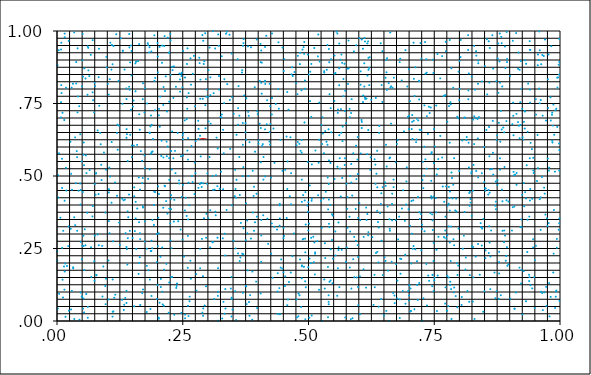
| Category | Series 0 |
|---|---|
| 0.650019433241347 | 0.019 |
| 0.913542592723124 | 0.714 |
| 0.797904704663123 | 0.699 |
| 0.63942652683806 | 0.049 |
| 0.111549496955486 | 0.275 |
| 0.98992359974181 | 0.515 |
| 0.315992959662965 | 0.502 |
| 0.451499784630852 | 0.294 |
| 0.560988519785409 | 0.813 |
| 0.569578690425192 | 0.776 |
| 0.130099128005586 | 0.749 |
| 0.347297645384479 | 0.922 |
| 0.921291770284048 | 0.676 |
| 0.933757099921347 | 0.537 |
| 0.237852281759125 | 0.121 |
| 0.0748587341847368 | 0.821 |
| 0.450344716827251 | 0.168 |
| 0.94974738769233 | 0.045 |
| 0.572588026317355 | 0.561 |
| 0.382621215065787 | 0.617 |
| 0.144555429906286 | 0.798 |
| 0.502400468850817 | 0.467 |
| 0.486402831806082 | 0.58 |
| 0.144873778371793 | 0.311 |
| 0.703877231389577 | 0.034 |
| 0.301079954218916 | 0.865 |
| 0.198864952521608 | 0.076 |
| 0.332374834870256 | 0.751 |
| 0.50634249399253 | 0.019 |
| 0.269702939405574 | 0.479 |
| 0.615368554757631 | 0.349 |
| 0.501592919238548 | 0.011 |
| 0.0826819807969012 | 0.438 |
| 0.281373972342455 | 0.662 |
| 0.702116884602505 | 0.033 |
| 0.0177920677915906 | 0.805 |
| 0.775410153946954 | 0.035 |
| 0.85998983905273 | 0.27 |
| 0.878420567562954 | 0.683 |
| 0.031789077001132 | 0.818 |
| 0.257822771674293 | 0.696 |
| 0.985117337145983 | 0.615 |
| 0.199939618646256 | 0.124 |
| 0.743976185086714 | 0.577 |
| 0.738020350828267 | 0.157 |
| 0.106136539610613 | 0.96 |
| 0.251252093617191 | 0.648 |
| 0.57844998840762 | 0.817 |
| 0.506653547682238 | 0.54 |
| 0.504749435963487 | 0.2 |
| 0.939466742251737 | 0.151 |
| 0.951914983616054 | 0.765 |
| 0.98667346409156 | 0.167 |
| 0.851555413261673 | 0.217 |
| 0.10337923052268 | 0.455 |
| 0.837539586669289 | 0.889 |
| 0.998464709563785 | 0.973 |
| 0.729810329262311 | 0.501 |
| 0.885481405270826 | 0.413 |
| 0.330166843618506 | 0.659 |
| 0.505476301252431 | 0.287 |
| 0.328421668051404 | 0.009 |
| 0.331609532729016 | 0.578 |
| 0.162597222977806 | 0.495 |
| 0.825008968455772 | 0.258 |
| 0.728716461472937 | 0.078 |
| 0.202477743817167 | 0.709 |
| 0.87887741172064 | 0.203 |
| 0.247689641334122 | 0.845 |
| 0.55959584128315 | 0.34 |
| 0.664274581809472 | 0.809 |
| 0.594596123569802 | 0.605 |
| 0.676714477244329 | 0.139 |
| 0.916712184842293 | 0.87 |
| 0.724460682739691 | 0.905 |
| 0.702797077665224 | 0.112 |
| 0.193746057533654 | 0.828 |
| 0.161142362609356 | 0.896 |
| 0.2856380355099 | 0.568 |
| 0.728294262673364 | 0.458 |
| 0.0144609247719709 | 0.693 |
| 0.539945575754017 | 0.066 |
| 0.0682296955020211 | 0.152 |
| 0.653398843069755 | 0.466 |
| 0.618600581812663 | 0.295 |
| 0.661080692482688 | 0.351 |
| 0.964912364211534 | 0.917 |
| 0.0624052649559319 | 0.864 |
| 0.849603717303589 | 0.479 |
| 0.695339743190939 | 0.53 |
| 0.8757009156601 | 0.485 |
| 0.997997651049539 | 0.612 |
| 0.755396027347833 | 0.034 |
| 0.859477871042445 | 0.327 |
| 0.819512076532325 | 0.442 |
| 0.159526645608055 | 0.388 |
| 0.676400586964848 | 0.078 |
| 0.370773335961853 | 0.958 |
| 0.8940920336608 | 0.997 |
| 0.43505499625744 | 0.748 |
| 0.961514891913874 | 0.314 |
| 0.818374066750562 | 0.615 |
| 0.705384576696664 | 0.301 |
| 0.344306480074546 | 0.594 |
| 0.229629740274298 | 0.865 |
| 0.347265514288562 | 0.081 |
| 0.489273841764584 | 0.434 |
| 0.880712452566315 | 0.561 |
| 0.489911198345699 | 0.283 |
| 0.378112325581699 | 0.346 |
| 0.893772981073077 | 0.416 |
| 0.143199838308547 | 0.436 |
| 0.817866183082069 | 0.795 |
| 0.468721284970693 | 0.845 |
| 0.0517758640451352 | 0.843 |
| 0.938502358391495 | 0.159 |
| 0.532623113930782 | 0.268 |
| 0.998338008732983 | 0.337 |
| 0.754463572388784 | 0.246 |
| 0.213132604161443 | 0.948 |
| 0.845397892319972 | 0.319 |
| 0.138102472963075 | 0.255 |
| 0.174527363971233 | 0.274 |
| 0.586945446238847 | 0.433 |
| 0.441101154633051 | 0.732 |
| 0.239929062050423 | 0.649 |
| 0.541766490213324 | 0.135 |
| 0.40595995382985 | 0.933 |
| 0.486745300910933 | 0.487 |
| 0.405175636590955 | 0.547 |
| 0.178653803478697 | 0.249 |
| 0.786353337823045 | 0.423 |
| 0.117794233022583 | 0.989 |
| 0.360944297748327 | 0.81 |
| 0.932363302340618 | 0.068 |
| 0.333188222929193 | 0.301 |
| 0.772749217011981 | 0.963 |
| 0.110420735504672 | 0.015 |
| 0.655775997117834 | 0.797 |
| 0.913600193890986 | 0.47 |
| 0.824595586068227 | 0.843 |
| 0.422215095114719 | 0.619 |
| 0.109007560532956 | 0.952 |
| 0.946661065525658 | 0.563 |
| 0.1043908958808 | 0.303 |
| 0.906095656391683 | 0.393 |
| 0.480153236599951 | 0.095 |
| 0.860399663374758 | 0.942 |
| 0.730526379707854 | 0.744 |
| 0.565065784573281 | 0.649 |
| 0.40293654385289 | 0.68 |
| 0.712640321671887 | 0.875 |
| 0.381147688274649 | 0.708 |
| 0.430308750032734 | 0.664 |
| 0.858909690392046 | 0.669 |
| 0.730528341952479 | 0.601 |
| 0.46284140437017 | 0.43 |
| 0.820284686426478 | 0.397 |
| 0.41337267812336 | 0.499 |
| 0.907701618988555 | 0.514 |
| 0.231331372858934 | 0.561 |
| 0.872534189787079 | 0.412 |
| 0.115428223981445 | 0.478 |
| 0.187915809816928 | 0.277 |
| 0.967756622830172 | 0.914 |
| 0.609548206085972 | 0.178 |
| 0.0527337200557445 | 0.078 |
| 0.62291498624542 | 0.521 |
| 0.258274812605185 | 0.771 |
| 0.412914511844483 | 0.827 |
| 0.18124626503784 | 0.49 |
| 0.130973599849021 | 0.932 |
| 0.425691601436877 | 0.232 |
| 0.140627974806496 | 0.552 |
| 0.616980702696693 | 0.369 |
| 0.169322449883479 | 0.475 |
| 0.488313434743307 | 0.281 |
| 0.186725544324701 | 0.577 |
| 0.923812363001745 | 0.323 |
| 0.540418978674543 | 0.472 |
| 0.320415093178555 | 0.101 |
| 0.0965769498909022 | 0.058 |
| 0.674148593616143 | 0.196 |
| 0.119334302460945 | 0.432 |
| 0.457870051487964 | 0.054 |
| 0.893453019275215 | 0.689 |
| 0.907559670056606 | 0.641 |
| 0.493050281479064 | 0.829 |
| 0.575578156910339 | 0.473 |
| 0.969051420855459 | 0.099 |
| 0.949986441955812 | 0.21 |
| 0.906283542221247 | 0.966 |
| 0.612838506870949 | 0.766 |
| 0.645414229581619 | 0.814 |
| 0.219563451263493 | 0.37 |
| 0.303374775741462 | 0.943 |
| 0.23552453366821 | 0.51 |
| 0.145600315239809 | 0.642 |
| 0.991922905825994 | 0.102 |
| 0.227065844689383 | 0.586 |
| 0.44561242764553 | 0.212 |
| 0.747165458877866 | 0.314 |
| 0.543765355083132 | 0.545 |
| 0.294871331241815 | 0.744 |
| 0.0766599890284499 | 0.435 |
| 0.0380832796245175 | 0.819 |
| 0.000969732157645952 | 0.882 |
| 0.391743729720097 | 0.311 |
| 0.603638981810214 | 0.815 |
| 0.226819409154927 | 0.386 |
| 0.608434313992281 | 0.755 |
| 0.636816930957454 | 0.238 |
| 0.296843438751619 | 0.773 |
| 0.290303332554167 | 0.154 |
| 0.1222495180289 | 0.828 |
| 0.605404588687509 | 0.693 |
| 0.259851772619127 | 0.183 |
| 0.015445767762079 | 0.978 |
| 0.725633805114893 | 0.317 |
| 0.380352968928714 | 0.5 |
| 0.952070233907624 | 0.259 |
| 0.817352581661365 | 0.935 |
| 0.0321066177204708 | 0.185 |
| 0.909564586119295 | 0.043 |
| 0.0382865836596439 | 0.893 |
| 0.817818091375442 | 0.765 |
| 0.044648232971714 | 0.004 |
| 0.404996833528221 | 0.893 |
| 0.210178790561285 | 0.057 |
| 0.304617155899945 | 0.254 |
| 0.312665960724126 | 0.076 |
| 0.798415736455056 | 0.86 |
| 0.3694817968952 | 0.097 |
| 0.908783630163221 | 0.503 |
| 0.997982642124078 | 0.85 |
| 0.157067233521285 | 0.894 |
| 0.190788632767396 | 0.628 |
| 0.992724487125009 | 0.732 |
| 0.343729692175012 | 0.762 |
| 0.213947059102899 | 0.982 |
| 0.925663479626782 | 0.634 |
| 0.567636879383149 | 0.62 |
| 0.282987636806011 | 0.908 |
| 0.569452969170236 | 0.834 |
| 0.00808825684332137 | 0.936 |
| 0.163239553407606 | 0.955 |
| 0.150484356356137 | 0.286 |
| 0.457845550690904 | 0.789 |
| 0.163175601139718 | 0.341 |
| 0.888795560607806 | 0.272 |
| 0.696488696607459 | 0.809 |
| 0.0139761805540775 | 0.188 |
| 0.689712403313547 | 0.654 |
| 0.779273535020672 | 0.741 |
| 0.531315797877848 | 0.857 |
| 0.423517719515217 | 0.608 |
| 0.818760131829447 | 0.854 |
| 0.376117052223967 | 0.12 |
| 0.6470579442826 | 0.931 |
| 0.742966321138021 | 0.736 |
| 0.110552035500213 | 0.885 |
| 0.192667993883522 | 0.4 |
| 0.506182620981093 | 0.415 |
| 0.885114359910683 | 0.809 |
| 0.234610663123545 | 0.587 |
| 0.0508361353399738 | 0.899 |
| 0.880750872022784 | 0.822 |
| 0.368326247478349 | 0.232 |
| 0.376375447880173 | 0.768 |
| 0.337700303239137 | 0.997 |
| 0.509632673587034 | 0.291 |
| 0.654973654768622 | 0.858 |
| 0.941124786114673 | 0.935 |
| 0.662519568237194 | 0.995 |
| 0.255735860053516 | 0.425 |
| 0.739735742376393 | 0.138 |
| 0.547584150479141 | 0.13 |
| 0.70461686991173 | 0.414 |
| 0.666900893086879 | 0.805 |
| 0.540589811445831 | 0.419 |
| 0.710510605454008 | 0.041 |
| 0.645113900583482 | 0.277 |
| 0.486726630734273 | 0.188 |
| 0.0757632133576928 | 0.809 |
| 0.49252438367081 | 0.416 |
| 0.348847014838554 | 0.04 |
| 0.927846534943452 | 0.172 |
| 0.851515262816362 | 0.449 |
| 0.200299961314574 | 0.912 |
| 0.323386413683172 | 0.456 |
| 0.921093768842726 | 0.755 |
| 0.699809204097905 | 0.071 |
| 0.136388189253776 | 0.303 |
| 0.212187393906055 | 0.052 |
| 0.231391191845081 | 0.769 |
| 0.789621169826782 | 0.116 |
| 0.331006409422679 | 0.066 |
| 0.941562268640044 | 0.614 |
| 0.365528199259807 | 0.338 |
| 0.470962119957467 | 0.302 |
| 0.403132675401951 | 0.827 |
| 0.369714491145545 | 0.499 |
| 0.148744370836342 | 0.605 |
| 0.588958444660724 | 0.578 |
| 0.260588733162385 | 0.35 |
| 0.132393144990497 | 0.416 |
| 0.0151555577319516 | 0.415 |
| 0.997422777566159 | 0.315 |
| 0.585219539284335 | 0.112 |
| 0.360014274470714 | 0.233 |
| 0.413523196956644 | 0.661 |
| 0.370542818588446 | 0.531 |
| 0.651358900615318 | 0.22 |
| 0.38563558460127 | 0.284 |
| 0.250438490193473 | 0.469 |
| 0.692316652175999 | 0.228 |
| 0.265411836502986 | 0.906 |
| 0.0177302814391588 | 0.528 |
| 0.354944676606949 | 0.25 |
| 0.0708485767337154 | 0.788 |
| 0.668184768108649 | 0.097 |
| 0.614416378966678 | 0.115 |
| 0.0572875543732563 | 0.571 |
| 0.540501282061132 | 0.938 |
| 0.773512960220327 | 0.464 |
| 0.699850097085079 | 0.662 |
| 0.793561136543082 | 0.422 |
| 0.291846256087618 | 0.886 |
| 0.074175363082951 | 0.206 |
| 0.897564944657603 | 0.412 |
| 0.833368412389253 | 0.517 |
| 0.583046280964628 | 0.5 |
| 0.836622138160511 | 0.63 |
| 0.281183233675094 | 0.628 |
| 0.138178633422156 | 0.632 |
| 0.748550152520715 | 0.103 |
| 0.938913777750866 | 0.36 |
| 0.506662828260622 | 0.422 |
| 0.708924876240856 | 0.96 |
| 0.626952800496421 | 0.289 |
| 0.108685428978344 | 0.617 |
| 0.498718682246387 | 0.919 |
| 0.0109068811921086 | 0.718 |
| 0.0880187975741183 | 0.539 |
| 0.673211768467339 | 0.548 |
| 0.356913897159791 | 0.487 |
| 0.464821945659999 | 0.167 |
| 0.00839326456534384 | 0.813 |
| 0.865488777273879 | 0.986 |
| 0.0550437967825524 | 0.316 |
| 0.771697173249163 | 0.778 |
| 0.012480906190376 | 0.311 |
| 0.205680159467213 | 0.221 |
| 0.884143795901099 | 0.66 |
| 0.66411329646042 | 0.681 |
| 0.33594058450324 | 0.991 |
| 0.745094897016659 | 0.582 |
| 0.49030295783431 | 0.944 |
| 0.448401667432809 | 0.518 |
| 0.442555199373011 | 0.329 |
| 0.385630716403117 | 0.944 |
| 0.410689194767185 | 0.565 |
| 0.561287145697986 | 0.641 |
| 0.378361655737519 | 0.302 |
| 0.0827918442423218 | 0.841 |
| 0.250587542025297 | 0.627 |
| 0.594424846734392 | 0.276 |
| 0.955851382929086 | 0.882 |
| 0.347802495033519 | 0.399 |
| 0.947867163148134 | 0.51 |
| 0.699985025024425 | 0.088 |
| 0.406078639736919 | 0.295 |
| 0.952412321636046 | 0.712 |
| 0.23227900364054 | 0.343 |
| 0.836248254276904 | 0.697 |
| 0.829333419599529 | 0.948 |
| 0.0565611771897969 | 0.261 |
| 0.521011891637175 | 0.625 |
| 0.223034854163622 | 0.756 |
| 0.0932734514124489 | 0.581 |
| 0.659437035797441 | 0.82 |
| 0.327536531221523 | 0.712 |
| 0.876097332593814 | 0.905 |
| 0.880869976790398 | 0.522 |
| 0.598003006469349 | 0.634 |
| 0.994546713275192 | 0.669 |
| 0.984534243307278 | 0.719 |
| 0.638247979134657 | 0.341 |
| 0.0614409045864405 | 0.049 |
| 0.646905578678258 | 0.755 |
| 0.225978958359622 | 0.968 |
| 0.701665184762426 | 0.329 |
| 0.776602819712466 | 0.398 |
| 0.31883614637054 | 0.465 |
| 0.00670798032668851 | 0.356 |
| 0.894491628180437 | 0.255 |
| 0.653059355291333 | 0.839 |
| 0.211872690692472 | 0.807 |
| 0.923587191092655 | 0.176 |
| 0.0428003030151031 | 0.449 |
| 0.789021385111155 | 0.099 |
| 0.567092682579486 | 0.493 |
| 0.481826554287649 | 0.611 |
| 0.0148245096061731 | 0.108 |
| 0.83017370571861 | 0.007 |
| 0.872808419161835 | 0.385 |
| 0.370749699153706 | 0.32 |
| 0.581358258450538 | 0.36 |
| 0.356943794459891 | 0.642 |
| 0.581740259098415 | 0.732 |
| 0.422811706973811 | 0.818 |
| 0.494566818734207 | 0.333 |
| 0.0961861895840562 | 0.374 |
| 0.0677215868405495 | 0.254 |
| 0.526413452486456 | 0.322 |
| 0.334512441219369 | 0.226 |
| 0.800233524680564 | 0.897 |
| 0.744053159520189 | 0.43 |
| 0.493819881410784 | 0.444 |
| 0.393548140395217 | 0.34 |
| 0.174793030576957 | 0.344 |
| 0.425310912350369 | 0.494 |
| 0.409858824498678 | 0.365 |
| 0.297749526071746 | 0.798 |
| 0.717532575161506 | 0.428 |
| 0.08316765911827 | 0.261 |
| 0.984093816562847 | 0.711 |
| 0.427422513915623 | 0.769 |
| 0.769758514238307 | 0.411 |
| 0.894748134325838 | 0.893 |
| 0.588851693157795 | 0.213 |
| 0.571617786685387 | 0.887 |
| 0.0751738056879494 | 0.472 |
| 0.75680074053516 | 0.157 |
| 0.785246921479967 | 0.493 |
| 0.110881435135526 | 0.032 |
| 0.576978388000185 | 0.87 |
| 0.258556921798759 | 0.886 |
| 0.138128064278324 | 0.765 |
| 0.885730490886935 | 0.311 |
| 0.996289437027121 | 0.84 |
| 0.48807877908389 | 0.936 |
| 0.519511887312088 | 0.988 |
| 0.334666592565462 | 0.11 |
| 0.772489507764785 | 0.116 |
| 0.975974270346598 | 0.833 |
| 0.539120003386462 | 0.385 |
| 0.72060890354436 | 0.375 |
| 0.827775389898807 | 0.151 |
| 0.363221345927673 | 0.207 |
| 0.389051278476255 | 0.518 |
| 0.619160423096189 | 0.907 |
| 0.620486074196791 | 0.873 |
| 0.927139614608698 | 0.625 |
| 0.615425655172693 | 0.767 |
| 0.990762357202134 | 0.726 |
| 0.666309522727804 | 0.439 |
| 0.374601063906179 | 0.65 |
| 0.561136946240827 | 0.871 |
| 0.409126354933664 | 0.61 |
| 0.783435647196964 | 0.326 |
| 0.512658610453177 | 0.16 |
| 0.860091875518446 | 0.442 |
| 0.857316016183058 | 0.436 |
| 0.310433407181059 | 0.452 |
| 0.562885684513758 | 0.526 |
| 0.789450866495667 | 0.561 |
| 0.348317106568428 | 0.772 |
| 0.249322826568031 | 0.806 |
| 0.356062937201904 | 0.003 |
| 0.795580023604694 | 0.704 |
| 0.360043298193107 | 0.734 |
| 0.621550662074427 | 0.91 |
| 0.787702328442949 | 0.47 |
| 0.88327346431266 | 0.98 |
| 0.930529374704616 | 0.723 |
| 0.93083011713974 | 0.899 |
| 0.295918273389461 | 0.834 |
| 0.0704048081079488 | 0.361 |
| 0.478976993888518 | 0.914 |
| 0.494683139753132 | 0.116 |
| 0.842835923569453 | 0.324 |
| 0.0989516644562558 | 0.875 |
| 0.644791338279398 | 0.44 |
| 0.982617948961942 | 0.948 |
| 0.974095958532252 | 0.354 |
| 0.718226470007246 | 0.692 |
| 0.497712402203415 | 0.398 |
| 0.475500643017723 | 0.82 |
| 0.838894465120305 | 0.703 |
| 0.90929872153425 | 0.395 |
| 0.152638027935463 | 0.605 |
| 0.444128393671819 | 0.624 |
| 0.375868590825 | 0.406 |
| 0.987855756623724 | 0.383 |
| 0.709277693908142 | 0.691 |
| 0.814704272924271 | 0.634 |
| 0.00797295427831235 | 0.755 |
| 0.440338507774913 | 0.961 |
| 0.964566393984246 | 0.096 |
| 0.266106505446092 | 0.146 |
| 0.685767069879463 | 0.388 |
| 0.372196366547674 | 0.778 |
| 0.889106558413256 | 0.312 |
| 0.928236833632597 | 0.687 |
| 0.95774969216194 | 0.9 |
| 0.396059362977545 | 0.136 |
| 0.58489980134649 | 0.541 |
| 0.735354958115932 | 0.706 |
| 0.92780194261084 | 0.476 |
| 0.61456807484397 | 0.391 |
| 0.156439967369744 | 0.411 |
| 0.112291642004535 | 0.948 |
| 0.623775525613526 | 0.564 |
| 0.0672672496845972 | 0.918 |
| 0.153497294504276 | 0.051 |
| 0.0519446495468424 | 0.043 |
| 0.619262003465038 | 0.866 |
| 0.866402611338251 | 0.69 |
| 0.682192942186778 | 0.215 |
| 0.450431606861512 | 0.322 |
| 0.972567218227284 | 0.118 |
| 0.633893383537419 | 0.769 |
| 0.86983872269124 | 0.167 |
| 0.103163665937027 | 0.443 |
| 0.918390455475775 | 0.673 |
| 0.64740471042435 | 0.462 |
| 0.491308625866491 | 0.921 |
| 0.58468598159332 | 0.717 |
| 0.86719497065476 | 0.505 |
| 0.437411576021542 | 0.315 |
| 0.407804932991903 | 0.604 |
| 0.553576633412813 | 0.855 |
| 0.849296375959005 | 0.6 |
| 0.226822422197537 | 0.434 |
| 0.178914603825042 | 0.75 |
| 0.538771815444515 | 0.013 |
| 0.823330118688047 | 0.51 |
| 0.940058782066133 | 0.798 |
| 0.527967056079926 | 0.702 |
| 0.217378216266864 | 0.197 |
| 0.56686016719422 | 0.89 |
| 0.0266954073651916 | 0.618 |
| 0.538669330654533 | 0.187 |
| 0.442709012855601 | 0.399 |
| 0.511489602197429 | 0.941 |
| 0.701629879617842 | 0.758 |
| 0.59526184808889 | 0.489 |
| 0.301503927675617 | 0.688 |
| 0.145462704707785 | 0.892 |
| 0.147058354716352 | 0.729 |
| 0.522145097752216 | 0.894 |
| 0.647604504589617 | 0.158 |
| 0.0168030013817523 | 0.014 |
| 0.87755413287115 | 0.787 |
| 0.962590595908618 | 0.885 |
| 0.199916808273097 | 0.959 |
| 0.905303049377971 | 0.679 |
| 0.612257218692378 | 0.964 |
| 0.909753434676885 | 0.042 |
| 0.505536043184982 | 0.704 |
| 0.889834832917884 | 0.531 |
| 0.103207212611056 | 0.344 |
| 0.602705983080799 | 0.347 |
| 0.975731307377641 | 0.56 |
| 0.536439659034966 | 0.866 |
| 0.393803347859429 | 0.584 |
| 0.685325381626552 | 0.829 |
| 0.0537784315827195 | 0.03 |
| 0.705258310595993 | 0.662 |
| 0.444700303919857 | 0.184 |
| 0.781243178667325 | 0.446 |
| 0.289069632762546 | 0.986 |
| 0.389397826913183 | 0.374 |
| 0.661891459682609 | 0.311 |
| 0.205090277606648 | 0.774 |
| 0.844599634817966 | 0.26 |
| 0.0342550024224207 | 0.357 |
| 0.13553407897583 | 0.079 |
| 0.782836044636484 | 0.747 |
| 0.108173101011566 | 0.867 |
| 0.587664307424569 | 0.01 |
| 0.220267551864777 | 0.602 |
| 0.770396060964544 | 0.287 |
| 0.0538596202358398 | 0.537 |
| 0.608188748703503 | 0.939 |
| 0.0162902899506134 | 0.198 |
| 0.639705065911926 | 0.323 |
| 0.593789407328026 | 0.386 |
| 0.5191003673991 | 0.434 |
| 0.548070080941897 | 0.364 |
| 0.68294389700113 | 0.163 |
| 0.138136024282182 | 0.104 |
| 0.171087259901073 | 0.391 |
| 0.806599079574231 | 0.249 |
| 0.290891222856549 | 0.475 |
| 0.822089852458619 | 0.408 |
| 0.770390395675037 | 0.777 |
| 0.777918632302446 | 0.051 |
| 0.170621165155339 | 0.493 |
| 0.527118762696037 | 0.61 |
| 0.432181750890264 | 0.325 |
| 0.775952109616128 | 0.156 |
| 0.153474499364663 | 0.461 |
| 0.771847332818232 | 0.312 |
| 0.397392120195175 | 0.36 |
| 0.734754358469453 | 0.525 |
| 0.745844433155872 | 0.368 |
| 0.483270469655837 | 0.925 |
| 0.248179238148113 | 0.856 |
| 0.561456554814907 | 0.117 |
| 0.376925389026571 | 0.058 |
| 0.678088121210545 | 0.281 |
| 0.00144306637275449 | 0.043 |
| 0.98184040591841 | 0.691 |
| 0.232490477071639 | 0.878 |
| 0.634209562541096 | 0.235 |
| 0.784055077101609 | 0.871 |
| 0.789488358615235 | 0.261 |
| 0.0400808163075038 | 0.311 |
| 0.493098573469885 | 0.801 |
| 0.657353841331287 | 0.395 |
| 0.398240047452418 | 0.723 |
| 0.761893924554557 | 0.837 |
| 0.999049167876344 | 0.353 |
| 0.319402155983952 | 0.595 |
| 0.721169687356631 | 0.66 |
| 0.636402420512136 | 0.38 |
| 0.263077519538957 | 0.399 |
| 0.13893489399532 | 0.248 |
| 0.476219233783443 | 0.606 |
| 0.968353023487789 | 0.46 |
| 0.887193842615262 | 0.667 |
| 0.289831389428361 | 0.766 |
| 0.274525686372453 | 0.74 |
| 0.273476652577845 | 0.438 |
| 0.419742036542408 | 0.266 |
| 0.249773489377816 | 0.64 |
| 0.681213258677641 | 0.893 |
| 0.49330597561721 | 0.137 |
| 0.143694025815469 | 0.99 |
| 0.900439049679136 | 0.845 |
| 0.44804265747386 | 0.181 |
| 0.707141537083294 | 0.249 |
| 0.88021696350717 | 0.991 |
| 0.878949424814684 | 0.164 |
| 0.714606496263641 | 0.626 |
| 0.723614296436081 | 0.369 |
| 0.315446315754911 | 0.365 |
| 0.579561758054355 | 0.871 |
| 0.163564692003906 | 0.713 |
| 0.225318400863191 | 0.99 |
| 0.978435429784518 | 0.529 |
| 0.153653843908615 | 0.43 |
| 0.499524480885048 | 0.185 |
| 0.356072900341644 | 0.425 |
| 0.45036795632459 | 0.286 |
| 0.078362404089466 | 0.157 |
| 0.0298072452563846 | 0.452 |
| 0.388143974452133 | 0.004 |
| 0.561132681656715 | 0.957 |
| 0.485328701491842 | 0.048 |
| 0.851098275324512 | 0.458 |
| 0.0152820788999105 | 0.991 |
| 0.18577987429868 | 0.041 |
| 0.0493242176999937 | 0.213 |
| 0.185845179709259 | 0.671 |
| 0.681580590112334 | 0.01 |
| 0.502058242602544 | 0.215 |
| 0.889064597886441 | 0.651 |
| 0.792777650526417 | 0.086 |
| 0.218351026653657 | 0.568 |
| 0.579674513579109 | 0.967 |
| 0.486456983259965 | 0.147 |
| 0.300410697538666 | 0.772 |
| 0.956090347508856 | 0.527 |
| 0.206534237957083 | 0.145 |
| 0.201456287932779 | 0.356 |
| 0.397307158665799 | 0.971 |
| 0.773127842401335 | 0.93 |
| 0.490930419201321 | 0.187 |
| 0.188103069136819 | 0.582 |
| 0.598069314155925 | 0.262 |
| 0.223141016381743 | 0.487 |
| 0.0807699149925061 | 0.657 |
| 0.503357038282847 | 0.86 |
| 0.183126896063541 | 0.926 |
| 0.837266956464954 | 0.898 |
| 0.427019217533608 | 0.336 |
| 0.359046766419833 | 0.903 |
| 0.769069187114069 | 0.776 |
| 0.694693829339685 | 0.481 |
| 0.33316465255931 | 0.025 |
| 0.15603850381056 | 0.792 |
| 0.682434025329907 | 0.905 |
| 0.833650225806598 | 0.915 |
| 0.428853639920259 | 0.149 |
| 0.214961025220653 | 0.465 |
| 0.369892242141804 | 0.949 |
| 0.0903602891722892 | 0.084 |
| 0.115757257494459 | 0.091 |
| 0.55828046491562 | 0.718 |
| 0.0323391843675641 | 0.182 |
| 0.847679126283453 | 0.352 |
| 0.861200735363892 | 0.523 |
| 0.442920388113409 | 0.403 |
| 0.29073811747987 | 0.043 |
| 0.878257649947676 | 0.077 |
| 0.370954380598679 | 0.972 |
| 0.518674161721849 | 0.912 |
| 0.465344443938806 | 0.402 |
| 0.719964230575818 | 0.764 |
| 0.510560190719834 | 0.203 |
| 0.426973277776418 | 0.712 |
| 0.0612381377393477 | 0.011 |
| 0.665306284551313 | 0.204 |
| 0.802598651666543 | 0.969 |
| 0.61083241593035 | 0.889 |
| 0.195099280838822 | 0.444 |
| 0.958808081436104 | 0.998 |
| 0.576995933346853 | 0.387 |
| 0.133638160437626 | 0.056 |
| 0.783505054017665 | 0.11 |
| 0.304878642864806 | 0.84 |
| 0.362496150878593 | 0.708 |
| 0.500905134409757 | 0.85 |
| 0.223027833050411 | 0.924 |
| 0.958599587276321 | 0.802 |
| 0.577437425026566 | 0.427 |
| 0.353638359291936 | 0.431 |
| 0.631216086993703 | 0.159 |
| 0.795874359370542 | 0.047 |
| 0.0709970132960375 | 0.969 |
| 0.881308287679872 | 0.618 |
| 0.540740202329513 | 0.554 |
| 0.619118121158108 | 0.306 |
| 0.582231597463134 | 0.702 |
| 0.213790064784278 | 0.466 |
| 0.812822324247943 | 0.219 |
| 0.379125706027482 | 0.175 |
| 0.585119190461373 | 0.477 |
| 0.662736964483515 | 0.805 |
| 0.413610289849818 | 0.945 |
| 0.708089234179302 | 0.416 |
| 0.456589752998772 | 0.355 |
| 0.228927011738026 | 0.654 |
| 0.000334294722831641 | 0.24 |
| 0.976369338388398 | 0.735 |
| 0.640712538567269 | 0.672 |
| 0.998814217499354 | 0.069 |
| 0.564585452060992 | 0.731 |
| 0.350838898531486 | 0.277 |
| 0.673629468310531 | 0.348 |
| 0.406188675895723 | 0.348 |
| 0.48652505856436 | 0.624 |
| 0.743982921462582 | 0.483 |
| 0.170688149022862 | 0.396 |
| 0.817325772322166 | 0.986 |
| 0.246940353966482 | 0.853 |
| 0.779049369190856 | 0.462 |
| 0.700105458309943 | 0.123 |
| 0.753852956747086 | 0.374 |
| 0.244629145357118 | 0.833 |
| 0.138070167080521 | 0.802 |
| 0.827041252500066 | 0.449 |
| 0.548598459726847 | 0.215 |
| 0.895287733345486 | 0.19 |
| 0.134362948153868 | 0.867 |
| 0.236408201147342 | 0.808 |
| 0.226626108267797 | 0.422 |
| 0.890539428609658 | 0.947 |
| 0.313215552489448 | 0.453 |
| 0.820756165837217 | 0.158 |
| 0.238490703717231 | 0.129 |
| 0.746787196670915 | 0.158 |
| 0.684270828233954 | 0.214 |
| 0.208917628946518 | 0.95 |
| 0.0921512191964628 | 0.188 |
| 0.912790336048098 | 0.993 |
| 0.432557559873133 | 0.545 |
| 0.979034082945932 | 0.016 |
| 0.26073713790496 | 0.63 |
| 0.284732465694965 | 0.766 |
| 0.91953646631802 | 0.184 |
| 0.810183046583659 | 0.701 |
| 0.242574235051236 | 0.485 |
| 0.585900242377719 | 0.765 |
| 0.750093374105698 | 0.14 |
| 0.993786082814606 | 0.253 |
| 0.0362302612315486 | 0.331 |
| 0.987299523056865 | 0.232 |
| 0.774056038637478 | 0.284 |
| 0.954258485507246 | 0.483 |
| 0.590773822740817 | 0.29 |
| 0.984650206551278 | 0.621 |
| 0.610983008591757 | 0.809 |
| 0.184672133701784 | 0.143 |
| 0.393134729262876 | 0.806 |
| 0.162336059172615 | 0.162 |
| 0.452021424224321 | 0.903 |
| 0.990296198685688 | 0.045 |
| 0.669068164355292 | 0.462 |
| 0.940205697435587 | 0.416 |
| 0.808896504090785 | 0.294 |
| 0.528480077351655 | 0.646 |
| 0.573028812822919 | 0.012 |
| 0.275232688759643 | 0.51 |
| 0.141644608250325 | 0.358 |
| 0.203862444041114 | 0.945 |
| 0.998498547792504 | 0.519 |
| 0.840476400980242 | 0.16 |
| 0.769286779454767 | 0.289 |
| 0.541875614648305 | 0.782 |
| 0.591207332295836 | 0.151 |
| 0.252452562058043 | 0.223 |
| 0.0185542472550476 | 0.45 |
| 0.699600544189215 | 0.868 |
| 0.745962368904438 | 0.12 |
| 0.998595271181906 | 0.589 |
| 0.546782321613701 | 0.368 |
| 0.844675999824918 | 0.509 |
| 0.143919858582704 | 0.943 |
| 0.181629531180616 | 0.175 |
| 0.195183890733085 | 0.838 |
| 0.804845900041193 | 0.083 |
| 0.398948579737424 | 0.713 |
| 0.544791401464373 | 0.903 |
| 0.96209902945688 | 0.101 |
| 0.873418108838305 | 0.827 |
| 0.723923430320764 | 0.658 |
| 0.397770499461015 | 0.044 |
| 0.0512185011750124 | 0.445 |
| 0.750974834254111 | 0.602 |
| 0.970981089651552 | 0.367 |
| 0.00337345808147793 | 0.934 |
| 0.882477628309166 | 0.089 |
| 0.780862766376162 | 0.27 |
| 0.270073594046755 | 0.852 |
| 0.438756666530579 | 0.024 |
| 0.566207061208199 | 0.246 |
| 0.782282103811918 | 0.755 |
| 0.850553233521791 | 0.879 |
| 0.165536248939108 | 0.055 |
| 0.781884335784323 | 0.124 |
| 0.81350455352964 | 0.624 |
| 0.10289987115918 | 0.781 |
| 0.697819008628192 | 0.704 |
| 0.223038947420433 | 0.926 |
| 0.91976974974245 | 0.866 |
| 0.727373220391252 | 0.549 |
| 0.260224356603603 | 0.052 |
| 0.676977227864104 | 0.623 |
| 0.658065486969759 | 0.174 |
| 0.283545564800919 | 0.889 |
| 0.716019169275744 | 0.124 |
| 0.0461305777570207 | 0.644 |
| 0.498591246449339 | 0.549 |
| 0.551518521917296 | 0.853 |
| 0.295296209068467 | 0.665 |
| 0.36002279858831 | 0.677 |
| 0.666294901644899 | 0.347 |
| 0.68133889467938 | 0.075 |
| 0.708892446496146 | 0.259 |
| 0.72136800910355 | 0.352 |
| 0.49200706110525 | 0.684 |
| 0.309237041629679 | 0.5 |
| 0.981511281391433 | 0.083 |
| 0.734108803603677 | 0.902 |
| 0.787609905033883 | 0.804 |
| 0.479872128520327 | 0.016 |
| 0.130750524012263 | 0.932 |
| 0.576087739477858 | 0.253 |
| 0.347213184425238 | 0.152 |
| 0.0717761082259893 | 0.761 |
| 0.829255144001583 | 0.61 |
| 0.924982191810538 | 0.731 |
| 0.0737789529040699 | 0.719 |
| 0.852140319423349 | 0.244 |
| 0.826986064659983 | 0.255 |
| 0.929895936400422 | 0.664 |
| 0.207989243455239 | 0.622 |
| 0.292177404444215 | 0.354 |
| 0.483285428399344 | 0.212 |
| 0.261397794768473 | 0.477 |
| 0.155755851211491 | 0.888 |
| 0.540820585317823 | 0.335 |
| 0.0281322191799801 | 0.508 |
| 0.476180166323832 | 0.074 |
| 0.217060060639395 | 0.413 |
| 0.00419368788292029 | 0.094 |
| 0.456447961579066 | 0.636 |
| 0.929928903152526 | 0.723 |
| 0.317193901740391 | 0.632 |
| 0.104106821693237 | 0.529 |
| 0.988482880168765 | 0.642 |
| 0.183918093703247 | 0.65 |
| 0.297160130578597 | 0.369 |
| 0.0974776041136708 | 0.522 |
| 0.207253736425631 | 0.569 |
| 0.486962202669083 | 0.192 |
| 0.472061098827888 | 0.858 |
| 0.717266950227825 | 0.073 |
| 0.461066425110138 | 0.134 |
| 0.669690085933353 | 0.839 |
| 0.376004544208236 | 0.625 |
| 0.810462630120535 | 0.376 |
| 0.304888427095795 | 0.779 |
| 0.901200142570393 | 0.077 |
| 0.233194876210838 | 0.418 |
| 0.687611136877299 | 0.103 |
| 0.872363319328741 | 0.481 |
| 0.382773941622665 | 0.018 |
| 0.266473747698682 | 0.815 |
| 0.706286524144845 | 0.71 |
| 0.540359450441423 | 0.058 |
| 0.827025018751291 | 0.694 |
| 0.605903200321928 | 0.665 |
| 0.204376249338373 | 0.67 |
| 0.661440201436038 | 0.318 |
| 0.345654596769987 | 0.112 |
| 0.605875648935438 | 0.971 |
| 0.923135936192608 | 0.801 |
| 0.959697131004502 | 0.933 |
| 0.0236471177593754 | 0.036 |
| 0.233221929679686 | 0.022 |
| 0.247331115122924 | 0.028 |
| 0.0471343257609694 | 0.273 |
| 0.148274947538586 | 0.931 |
| 0.275669808180437 | 0.62 |
| 0.861826645588866 | 0.222 |
| 0.184193892633903 | 0.648 |
| 0.31441204912572 | 0.94 |
| 0.955461420668973 | 0.641 |
| 0.772108678368065 | 0.36 |
| 0.894782527439852 | 0.904 |
| 0.800355800435199 | 0.8 |
| 0.692726803565975 | 0.934 |
| 0.816001190553321 | 0.103 |
| 0.217894590454389 | 0.618 |
| 0.453618384489927 | 0.154 |
| 0.656253199988544 | 0.906 |
| 0.364601634245637 | 0.219 |
| 0.119118630792488 | 0.648 |
| 0.544109729409636 | 0.734 |
| 0.254617921239004 | 0.009 |
| 0.748348127956292 | 0.855 |
| 0.0441399375440231 | 0.741 |
| 0.375254063909556 | 0.278 |
| 0.10845943111405 | 0.408 |
| 0.140764749249701 | 0.286 |
| 0.584205980192799 | 0.006 |
| 0.388420812905653 | 0.171 |
| 0.258888236956576 | 0.732 |
| 0.157467897694463 | 0.248 |
| 0.310129520713381 | 0.272 |
| 0.746633884609613 | 0.159 |
| 0.0772783211085589 | 0.508 |
| 0.254196254558507 | 0.692 |
| 0.75733985957415 | 0.524 |
| 0.877456246937722 | 0.957 |
| 0.799644131558797 | 0.761 |
| 0.771627519902342 | 0.06 |
| 0.259355875845782 | 0.94 |
| 0.534257751453778 | 0.446 |
| 0.893125643589559 | 0.224 |
| 0.0581396915398941 | 0.093 |
| 0.396721138104435 | 0.439 |
| 0.03997034180465 | 0.565 |
| 0.981050020465164 | 0.771 |
| 0.50308001025947 | 0.758 |
| 0.780297427771669 | 0.424 |
| 0.662023778130194 | 0.564 |
| 0.69828220764127 | 0.103 |
| 0.112110345920857 | 0.033 |
| 0.0374346073881735 | 0.475 |
| 0.218671464038972 | 0.722 |
| 0.56384778289775 | 0.901 |
| 0.300718874193199 | 0.355 |
| 0.319836164727925 | 0.087 |
| 0.416107325540231 | 0.984 |
| 0.831191148707153 | 0.798 |
| 0.237033636656568 | 0.114 |
| 0.715771597076264 | 0.206 |
| 0.712238572639985 | 0.247 |
| 0.749468091703648 | 0.662 |
| 0.24103321916797 | 0.344 |
| 0.940016787032612 | 0.561 |
| 0.778596519447015 | 0.326 |
| 0.0344798639420685 | 0.007 |
| 0.796142255880537 | 0.159 |
| 0.520187606253759 | 0.546 |
| 0.274040011438266 | 0.546 |
| 0.265135260872027 | 0.208 |
| 0.261478741826738 | 0.017 |
| 0.546621432289133 | 0.279 |
| 0.170890535274617 | 0.82 |
| 0.724274758569711 | 0.244 |
| 0.148833795957463 | 0.565 |
| 0.194597085307245 | 0.727 |
| 0.498975413848794 | 0.377 |
| 0.00779810233031652 | 0.702 |
| 0.53998604526878 | 0.089 |
| 0.166709003312743 | 0.586 |
| 0.602257581858902 | 0.024 |
| 0.40459002017515 | 0.956 |
| 0.351405065643975 | 0.714 |
| 0.0505408981620406 | 0.26 |
| 0.640451670884988 | 0.649 |
| 0.060950549461152 | 0.947 |
| 0.828044349224368 | 0.538 |
| 0.187501358644409 | 0.242 |
| 0.744742423008019 | 0.423 |
| 0.748481189565116 | 0.428 |
| 0.713878601276861 | 0.617 |
| 0.631456593483096 | 0.558 |
| 0.875064219992101 | 0.64 |
| 0.284035788105974 | 0.472 |
| 0.18696874118741 | 0.709 |
| 0.558556572401337 | 0.729 |
| 0.418259724023508 | 0.353 |
| 0.748539313074015 | 0.207 |
| 0.216226787094346 | 0.844 |
| 0.782631562752613 | 0.207 |
| 0.710857442741178 | 0.776 |
| 0.31444409653271 | 0.377 |
| 0.946530394850306 | 0.282 |
| 0.0407017450496926 | 0.719 |
| 0.797780256109612 | 0.191 |
| 0.824494018510895 | 0.363 |
| 0.837299581051702 | 0.495 |
| 0.143347030663937 | 0.808 |
| 0.559910633702323 | 0.254 |
| 0.997513359753491 | 0.884 |
| 0.956329973017499 | 0.919 |
| 0.730580065926806 | 0.31 |
| 0.248156108169804 | 0.428 |
| 0.326097289591918 | 0.515 |
| 0.1521571482803 | 0.76 |
| 0.290449396515762 | 0.018 |
| 0.188157879832878 | 0.676 |
| 0.501096340921415 | 0.336 |
| 0.606066969202127 | 0.686 |
| 0.511743415506355 | 0.271 |
| 0.0542711036009707 | 0.871 |
| 0.0605146245721749 | 0.78 |
| 0.859575248750237 | 0.568 |
| 0.0154288895683107 | 0.171 |
| 0.919749244834193 | 0.63 |
| 0.320244931865888 | 0.182 |
| 0.0868354695499402 | 0.61 |
| 0.994854150732769 | 0.805 |
| 0.635029811472743 | 0.508 |
| 0.0751300034987418 | 0.295 |
| 0.0464962317746327 | 0.402 |
| 0.819599973951992 | 0.066 |
| 0.941344181601797 | 0.124 |
| 0.883921681678998 | 0.958 |
| 0.0834602097772542 | 0.939 |
| 0.407228912902727 | 0.891 |
| 0.186463132417768 | 0.241 |
| 0.978407743230592 | 0.13 |
| 0.263390750917041 | 0.068 |
| 0.225604944868016 | 0.278 |
| 0.374994731955017 | 0.12 |
| 0.873996388262888 | 0.625 |
| 0.284671876493028 | 0.249 |
| 0.320028770625023 | 0.001 |
| 0.0392761242146791 | 0.586 |
| 0.482877899220536 | 0.886 |
| 0.82098796771086 | 0.445 |
| 0.467371759136768 | 0.875 |
| 0.811918283720662 | 0.177 |
| 0.805653248882535 | 0.623 |
| 0.875687783964304 | 0.469 |
| 0.60881830064528 | 0.778 |
| 0.842383055875569 | 0.337 |
| 0.260273570800551 | 0.294 |
| 0.961730585743114 | 0.762 |
| 0.080746367122813 | 0.298 |
| 0.582766329072651 | 0.308 |
| 0.374811469589839 | 0.682 |
| 0.59726750993167 | 0.557 |
| 0.170374109451626 | 0.765 |
| 0.680252459389369 | 0.36 |
| 0.781047781855906 | 0.381 |
| 0.33722026459749 | 0.383 |
| 0.165466725960535 | 0.282 |
| 0.289043357782244 | 0.029 |
| 0.227627063374587 | 0.251 |
| 0.321446722880081 | 0.949 |
| 0.765676164582062 | 0.913 |
| 0.31916750683218 | 0.287 |
| 0.735621211252536 | 0.053 |
| 0.0745637053868818 | 0.139 |
| 0.450780648150054 | 0.862 |
| 0.491665254451099 | 0.962 |
| 0.298933039237382 | 0.509 |
| 0.541280943838946 | 0.892 |
| 0.169271117999135 | 0.096 |
| 0.354208879641993 | 0.521 |
| 0.214727359013613 | 0.793 |
| 0.170981074292796 | 0.109 |
| 0.912216858756083 | 0.098 |
| 0.0601216227002181 | 0.373 |
| 0.406958766802271 | 0.784 |
| 0.200532564422635 | 0.258 |
| 0.243126456591247 | 0.474 |
| 0.290736048106732 | 0.966 |
| 0.381799106113837 | 0.065 |
| 0.26026671787822 | 0.556 |
| 0.599108390923964 | 0.054 |
| 0.052461068424907 | 0.573 |
| 0.180513998472018 | 0.958 |
| 0.675792294713356 | 0.61 |
| 0.940077033257359 | 0.935 |
| 0.424212838645208 | 0.679 |
| 0.459253257893169 | 0.074 |
| 0.0543411033053613 | 0.176 |
| 0.932584889093351 | 0.887 |
| 0.794997755922577 | 0.2 |
| 0.422769209138628 | 0.651 |
| 0.0101484132045169 | 0.459 |
| 0.513098029309192 | 0.232 |
| 0.159211339820097 | 0.607 |
| 0.201954976959293 | 0.012 |
| 0.183809189012719 | 0.944 |
| 0.0470810586944059 | 0.098 |
| 0.752770468025299 | 0.424 |
| 0.977465337754866 | 0.338 |
| 0.192685660381197 | 0.331 |
| 0.26826331256212 | 0.5 |
| 0.562089551658696 | 0.561 |
| 0.202609555712811 | 0.438 |
| 0.028002942865222 | 0.04 |
| 0.464053794811926 | 0.633 |
| 0.189383136458553 | 0.251 |
| 0.766893258174427 | 0.464 |
| 0.969652640567398 | 0.439 |
| 0.788225716435587 | 0.282 |
| 0.288228122657381 | 0.283 |
| 0.698930831552636 | 0.386 |
| 0.798406296855047 | 0.319 |
| 0.603660705196916 | 0.861 |
| 0.140418621510546 | 0.378 |
| 0.0711957906662141 | 0.396 |
| 0.959704206132486 | 0.42 |
| 0.423996687469966 | 0.741 |
| 0.296425429797192 | 0.287 |
| 0.47810102402046 | 0.782 |
| 0.2282939612371 | 0.522 |
| 0.61882986583195 | 0.658 |
| 0.655406339207712 | 0.533 |
| 0.164798722278451 | 0.303 |
| 0.654698020944618 | 0.035 |
| 0.164441060450152 | 0.659 |
| 0.612279272383369 | 0.77 |
| 0.330212768219592 | 0.454 |
| 0.0225092336424815 | 0.258 |
| 0.22885004838879 | 0.876 |
| 0.879055729151076 | 0.239 |
| 0.443115364662219 | 0.354 |
| 0.0120175953602095 | 0.081 |
| 0.858364753455823 | 0.965 |
| 0.513161766487982 | 0.237 |
| 0.644457511305935 | 0.076 |
| 0.944754495950846 | 0.113 |
| 0.551921803003122 | 0.49 |
| 0.74708846928408 | 0.901 |
| 0.9254797665625 | 0.023 |
| 0.285214833848328 | 0.832 |
| 0.551714933204195 | 0.915 |
| 0.120395666057567 | 0.677 |
| 0.202859694000091 | 0.731 |
| 0.940852184874211 | 0.455 |
| 0.0492281901118667 | 0.084 |
| 0.261678251242494 | 0.786 |
| 0.284405389655578 | 0.639 |
| 0.122839878386749 | 0.674 |
| 0.325148127914838 | 0.704 |
| 0.023033272185252 | 0.326 |
| 0.948846246065026 | 0.151 |
| 0.732562425622248 | 0.853 |
| 0.00985939557485216 | 0.559 |
| 0.994459025752826 | 0.839 |
| 0.208674860897134 | 0.89 |
| 0.725957735173972 | 0.332 |
| 0.138071368588018 | 0.062 |
| 0.193548898235113 | 0.985 |
| 0.694285404395865 | 0.402 |
| 0.1748037723158 | 0.802 |
| 0.977939601815918 | 0.519 |
| 0.778535160744951 | 0.15 |
| 0.706173725343413 | 0.687 |
| 0.077748534579224 | 0.51 |
| 0.169393118068793 | 0.552 |
| 0.0418981526332129 | 0.774 |
| 0.970211814562735 | 0.97 |
| 0.601122507842136 | 0.407 |
| 0.611255682399368 | 0.976 |
| 0.746570151190952 | 0.347 |
| 0.992878467685808 | 0.105 |
| 0.173887871753177 | 0.572 |
| 0.493663909509602 | 0.237 |
| 0.524932085105222 | 0.415 |
| 0.36349708334052 | 0.434 |
| 0.780747672745964 | 0.969 |
| 0.457912682981155 | 0.455 |
| 0.329672880227185 | 0.285 |
| 0.780692009832398 | 0.615 |
| 0.0473502698065917 | 0.452 |
| 0.531320794653212 | 0.143 |
| 0.198639925117503 | 0.203 |
| 0.726563098516891 | 0.486 |
| 0.799669482331546 | 0.517 |
| 0.189820089630347 | 0.348 |
| 0.404933734851837 | 0.095 |
| 0.477075639358876 | 0.013 |
| 0.616723296991576 | 0.575 |
| 0.482184096913587 | 0.089 |
| 0.665919929262387 | 0.404 |
| 0.86724849911081 | 0.87 |
| 0.0974208105039334 | 0.146 |
| 0.704197894489614 | 0.198 |
| 0.873961421304111 | 0.103 |
| 0.595811388227642 | 0.15 |
| 0.5573701556548 | 0.991 |
| 0.101157406151852 | 0.818 |
| 0.0494572684500313 | 0.809 |
| 0.3103628185632 | 1 |
| 0.531187716705973 | 0.862 |
| 0.632937908894356 | 0.539 |
| 0.049313504762462 | 0.55 |
| 0.332736628070934 | 0.834 |
| 0.410403813118844 | 0.488 |
| 0.67083917059595 | 0.088 |
| 0.837098645112674 | 0.265 |
| 0.837049788373867 | 0.818 |
| 0.206438326401129 | 0.117 |
| 0.181178995079371 | 0.951 |
| 0.535861865834969 | 0.618 |
| 0.598514369953658 | 0.117 |
| 0.754986514116889 | 0.505 |
| 0.849699935847884 | 0.103 |
| 0.225914858104552 | 0.849 |
| 0.211335476488312 | 0.745 |
| 0.884498103881515 | 0.453 |
| 0.0497939679826881 | 0.083 |
| 0.250622175993134 | 0.571 |
| 0.102287056254369 | 0.208 |
| 0.245727623911895 | 0.315 |
| 0.973125236105109 | 0.052 |
| 0.390851080553476 | 0.431 |
| 0.571931479852546 | 0.538 |
| 0.940662274764244 | 0.753 |
| 0.342788427704868 | 0.987 |
| 0.93556052090241 | 0.349 |
| 0.465363370654759 | 0.51 |
| 0.154795408307811 | 0.31 |
| 0.754035919697997 | 0.743 |
| 0.595075011311187 | 0.951 |
| 0.864617057459302 | 0.524 |
| 0.70676299595889 | 0.628 |
| 0.27215128486114 | 0.914 |
| 0.413992234995538 | 0.818 |
| 0.110753283088886 | 0.143 |
| 0.692730198050566 | 0.06 |
| 0.294627975642472 | 0.992 |
| 0.0530774489012309 | 0.616 |
| 0.257772291881537 | 0.362 |
| 0.537715332128288 | 0.952 |
| 0.499562365649144 | 0.312 |
| 0.652403659042093 | 0.478 |
| 0.629285289558052 | 0.056 |
| 0.276763827266195 | 0.162 |
| 0.478838781690455 | 0.617 |
| 0.246440917908175 | 0.568 |
| 0.453269061863944 | 0.12 |
| 0.631870642495659 | 0.116 |
| 0.822142164478839 | 0.421 |
| 0.405912483180881 | 0.204 |
| 0.220079343434988 | 0.977 |
| 0.22201947601794 | 0.028 |
| 0.61846411421259 | 0.964 |
| 0.29825804683827 | 0.473 |
| 0.897309187450418 | 0.195 |
| 0.201010856347736 | 0.464 |
| 0.582250109465133 | 0.185 |
| 0.555617059986255 | 0.998 |
| 0.0648485415038209 | 0.521 |
| 0.48607533685695 | 0.796 |
| 0.791634195478278 | 0.381 |
| 0.929026438292595 | 0.396 |
| 0.60200599052588 | 0.154 |
| 0.924827237882495 | 0.435 |
| 0.776117732425207 | 0.687 |
| 0.139850826128896 | 0.195 |
| 0.40074009186043 | 0.611 |
| 0.617328731615222 | 0.846 |
| 0.824439605441772 | 0.515 |
| 0.598605225092489 | 0.356 |
| 0.527122115464281 | 0 |
| 0.369531996070447 | 0.608 |
| 0.749250612488983 | 0.545 |
| 0.574703608050772 | 0.682 |
| 0.986920691951723 | 0.746 |
| 0.92210358678122 | 0.896 |
| 0.458407383238618 | 0.55 |
| 0.322344244757298 | 0.798 |
| 0.0885485349775871 | 0.486 |
| 0.53769153907653 | 0.608 |
| 0.0409472046814956 | 0.94 |
| 0.311487092867315 | 0.786 |
| 0.972152032604376 | 0.691 |
| 0.0022294448252107 | 0.503 |
| 0.879742792810721 | 0.895 |
| 0.267365161348917 | 0.603 |
| 0.559561737727574 | 0.245 |
| 0.964153292207571 | 0.497 |
| 0.726183755672599 | 0.001 |
| 0.993825665002789 | 0.283 |
| 0.0642260164508944 | 0.844 |
| 0.400916243853896 | 0.623 |
| 0.654517839278747 | 0.899 |
| 0.438571025056097 | 0.102 |
| 0.308925450934795 | 0.272 |
| 0.671389187574763 | 0.062 |
| 0.939740288770164 | 0.965 |
| 0.0898590562440641 | 0.259 |
| 0.254615269719552 | 0.022 |
| 0.184341057257549 | 0.523 |
| 0.30476464628854 | 0.382 |
| 0.542945557076631 | 0.401 |
| 0.417709620358689 | 0.761 |
| 0.565468656363281 | 0.919 |
| 0.493745282061225 | 0.006 |
| 0.53336452408943 | 0.217 |
| 0.439652279155884 | 0.799 |
| 0.493222654021251 | 0.284 |
| 0.178600426878626 | 0.19 |
| 0.189854509803321 | 0.585 |
| 0.642197087129897 | 0.372 |
| 0.0525002047219652 | 0.294 |
| 0.0586324447431647 | 0.51 |
| 0.936692328813784 | 0.819 |
| 0.63647723960951 | 0.587 |
| 0.209113496950511 | 0.253 |
| 0.362440719996052 | 0.566 |
| 0.280660523990022 | 0.69 |
| 0.448407952656311 | 0.943 |
| 0.223259173494133 | 0.387 |
| 0.720097747408166 | 0.131 |
| 0.742336083759646 | 0.372 |
| 0.859540640352553 | 0.822 |
| 0.521482678034719 | 0.753 |
| 0.922843086803325 | 0.35 |
| 0.113892090070924 | 0.08 |
| 0.907167808659115 | 0.707 |
| 0.959653643943365 | 0.751 |
| 0.0110921784506143 | 0.142 |
| 0.758005383964125 | 0.558 |
| 0.287674973768272 | 0.462 |
| 0.244721621905773 | 0.791 |
| 0.438931043328824 | 0.165 |
| 0.775883400225583 | 0.295 |
| 0.379605882144913 | 0.947 |
| 0.965503744235479 | 0.708 |
| 0.740861564367135 | 0.717 |
| 0.00906350844877734 | 0.786 |
| 0.138296639027984 | 0.662 |
| 0.0232294449682115 | 0.966 |
| 0.998608565852614 | 0.893 |
| 0.739417543641876 | 0.739 |
| 0.0857959032582093 | 0.649 |
| 0.466105621563807 | 0.851 |
| 0.748801034366939 | 0.27 |
| 0.811360316570672 | 0.701 |
| 0.892189246472183 | 0.208 |
| 0.643538183532168 | 0.958 |
| 0.715435624579587 | 0.697 |
| 0.722602085710403 | 0.958 |
| 0.249498935391188 | 0.281 |
| 0.557584371129082 | 0.532 |
| 0.228997808296027 | 0.152 |
| 0.0102384768280774 | 0.252 |
| 0.413789128920256 | 0.828 |
| 0.486905324284602 | 0.411 |
| 0.320398162613594 | 0.988 |
| 0.574458850668476 | 0.204 |
| 0.538084070105016 | 0.495 |
| 0.652999746225977 | 0.207 |
| 0.0566112901451744 | 0.836 |
| 0.029103437188088 | 0.805 |
| 0.147168626132278 | 0.95 |
| 0.804353823841696 | 0.055 |
| 0.293651037692696 | 0.053 |
| 0.756335483533718 | 0.92 |
| 0.558440607931178 | 0.182 |
| 0.660353644631637 | 0 |
| 0.750861357837346 | 0.149 |
| 0.932453814133994 | 0.423 |
| 0.598594212158512 | 0.221 |
| 0.734362139437138 | 0.197 |
| 0.0509511688603146 | 0.99 |
| 0.326571409808743 | 0.702 |
| 0.765660708351416 | 0.564 |
| 0.55152529970184 | 0.759 |
| 0.758375061128667 | 0.29 |
| 0.198882000077735 | 0.3 |
| 0.225207317355054 | 0.337 |
| 0.0981187112565153 | 0.911 |
| 0.709560161170403 | 0.835 |
| 0.00266379629165203 | 0.426 |
| 0.699828235670305 | 0.707 |
| 0.187614686688662 | 0.929 |
| 0.226836635405258 | 0.151 |
| 0.00409006904381004 | 0.579 |
| 0.844852576752155 | 0.826 |
| 0.156378318612582 | 0.354 |
| 0.104910430605371 | 0.834 |
| 0.564137545894538 | 0.429 |
| 0.603809926098236 | 0.578 |
| 0.761966800112066 | 0.638 |
| 0.85528420675193 | 0.781 |
| 0.123417272963226 | 0.339 |
| 0.620776640485621 | 0.813 |
| 0.0341084559559708 | 0.995 |
| 0.33835331834345 | 0.817 |
| 0.139103116727729 | 0.644 |
| 0.443213429744172 | 0.023 |
| 0.281215739655753 | 0.459 |
| 0.633289317339468 | 0.473 |
| 0.961450095014013 | 0.426 |
| 0.296286325075179 | 0.12 |
| 0.150960734156412 | 0.739 |
| 0.126897701166561 | 0.975 |
| 0.367727758099337 | 0.857 |
| 0.120706400227243 | 0.591 |
| 0.913793564393658 | 0.51 |
| 0.541527326216667 | 0.324 |
| 0.303340986218975 | 0.565 |
| 0.105624999913929 | 0.498 |
| 0.63903012421427 | 0.202 |
| 0.826668353752915 | 0.067 |
| 0.132867082744406 | 0.038 |
| 0.517344242589267 | 0.275 |
| 0.847452727365296 | 0.032 |
| 0.163465485407472 | 0.2 |
| 0.719810240252165 | 0.828 |
| 0.513702511121139 | 0.588 |
| 0.125215086883693 | 0.262 |
| 0.505601364111546 | 0.886 |
| 0.858496988114021 | 0.234 |
| 0.938698987907987 | 0.138 |
| 0.10242187454 | 0.074 |
| 0.57771201364774 | 0.322 |
| 0.36806511062264 | 0.865 |
| 0.854679251438146 | 0.972 |
| 0.530734011638438 | 0.579 |
| 0.643820525546457 | 0.404 |
| 0.254280119467001 | 0.381 |
| 0.369396897304189 | 0.683 |
| 0.985651520768084 | 0.674 |
| 0.934956972512888 | 0.238 |
| 0.178454834342197 | 0.031 |
| 0.871544270358146 | 0.079 |
| 0.818895384582373 | 0.529 |
| 0.557098208209992 | 0.087 |
| 0.567966623058123 | 0.67 |
| 0.263779095798304 | 0.084 |
| 0.921377658827628 | 0.324 |
| 0.525728891770093 | 0.676 |
| 0.857871316045932 | 0.452 |
| 0.460159411327525 | 0.729 |
| 0.975033772182213 | 0.328 |
| 0.173729856812058 | 0.719 |
| 0.0960047881818469 | 0.121 |
| 0.545326689440147 | 0.651 |
| 0.917385697423633 | 0.926 |
| 0.370231670780071 | 0.23 |
| 0.598111924055941 | 0.507 |
| 0.417030264040171 | 0.678 |
| 0.406115191443666 | 0.821 |
| 0.922673792369726 | 0.129 |
| 0.700879671016916 | 0.123 |
| 0.259248148613704 | 0.587 |
| 0.832412043208164 | 0.222 |
| 0.0460597453457329 | 0.474 |
| 0.784187690146709 | 0.007 |
| 0.0199153260356257 | 0.19 |
| 0.778693961784605 | 0.404 |
| 0.209571576143034 | 0.101 |
| 0.882399000107951 | 0.724 |
| 0.732465865590152 | 0.557 |
| 0.405223172538449 | 0.666 |
| 0.187896439938943 | 0.086 |
| 0.590296321695531 | 0.929 |
| 0.250518171183505 | 0.931 |
| 0.129374341431878 | 0.073 |
| 0.346829995475312 | 0.016 |
| 0.802180167895618 | 0.91 |
| 0.243470006286681 | 0.853 |
| 0.078250028739305 | 0.159 |
| 0.22298222703158 | 0.562 |
| 0.499601027032345 | 0.41 |
| 0.286628290184386 | 0.476 |
| 0.794334736475344 | 0.378 |
| 0.553751452850785 | 0.226 |
| 0.0622056345331116 | 0.942 |
| 0.904438067607732 | 0.312 |
| 0.391775845619891 | 0.463 |
| 0.734941091361985 | 0.856 |
| 0.784259467909079 | 0.512 |
| 0.211528993845268 | 0.564 |
| 0.543914175643639 | 0.14 |
| 0.453567665159611 | 0.521 |
| 0.380017686204651 | 0.721 |
| 0.000574657888016361 | 0.208 |
| 0.292901219468085 | 0.896 |
| 0.636857438244802 | 0.461 |
| 0.468094462565498 | 0.223 |
| 0.829568096275152 | 0.706 |
| 0.93571728780678 | 0.652 |
| 0.322004243853031 | 0.845 |
| 0.731722732109595 | 0.962 |
| 0.383852138440992 | 0.089 |
| 0.906791225469599 | 0.753 |
| 0.544142107651193 | 0.247 |
| 0.520921586470061 | 0.107 |
| 0.532401197060102 | 0.112 |
| 0.305348771822986 | 0.68 |
| 0.129827718085144 | 0.421 |
| 0.174491528287159 | 0.527 |
| 0.946634224861573 | 0.254 |
| 0.427458798697429 | 0.991 |
| 0.890803914989699 | 0.294 |
| 0.202128733083189 | 0.303 |
| 0.148139018012171 | 0.847 |
| 0.832465458680738 | 0.699 |
| 0.347404783745749 | 0.076 |
| 0.844417630340078 | 0.322 |
| 0.0839717123551115 | 0.742 |
| 0.866692808471906 | 0.58 |
| 0.991644444849073 | 0.084 |
| 0.355013441544439 | 0.455 |
| 0.200548952706759 | 0.858 |
| 0.277320800562868 | 0.105 |
| 0.861448402574284 | 0.11 |
| 0.442157853635593 | 0.113 |
| 0.539871719665326 | 0.661 |
| 0.165048411884532 | 0.453 |
| 0.688086454921772 | 0.451 |
| 0.334965183545686 | 0.043 |
| 0.533281478868285 | 0.655 |
| 0.930598923490286 | 0.444 |
| 0.624842436502156 | 0.763 |
| 0.211144971113454 | 0.391 |
| 0.327431028680247 | 0.913 |
| 0.853662057506251 | 0.659 |
| 0.193348816704438 | 0.446 |
| 0.661192235191957 | 0.561 |
| 0.609629651173495 | 0.29 |
| 0.944233400331506 | 0.593 |
| 0.0273884211237156 | 0.318 |
| 0.833169529330645 | 0.93 |
| 0.203949432303245 | 0.063 |
| 0.0527518276465363 | 0.259 |
| 0.484289901318288 | 0.587 |
| 0.891580127078625 | 0.872 |
| 0.35444793373215 | 0.103 |
| 0.871126534108371 | 0.397 |
| 0.977026414825452 | 0.919 |
| 0.916544608739031 | 0.686 |
| 0.965862662277807 | 0.037 |
| 0.6169135424553 | 0.957 |
| 0.223124408195283 | 0.133 |
| 0.654113029363882 | 0.608 |
| 0.572919856932784 | 0.794 |
| 0.852478729154949 | 0.457 |
| 0.946925862077955 | 0.519 |
| 0.669064715924811 | 0.487 |
| 0.036029059101307 | 0.633 |
| 0.164613301205854 | 0.22 |
| 0.944769557477032 | 0.421 |
| 0.13487209844586 | 0.419 |
| 0.0296002404872796 | 0.104 |
| 0.572453465113285 | 0.724 |
| 0.737346080715735 | 0.645 |
| 0.529811300249388 | 0.422 |
| 0.601133249367405 | 0.975 |
| 0.212985136825696 | 0.177 |
| 0.781783704838596 | 0.135 |
| 0.254444093731254 | 0.84 |
| 0.284554916985358 | 0.182 |
| 0.202556616047872 | 0.008 |
| 0.720382037798262 | 0.827 |
| 0.910857929050627 | 0.504 |
| 0.863058574078147 | 0.312 |
| 0.691582538227384 | 0.345 |
| 0.00861569028503095 | 0.959 |
| 0.553291274819963 | 0.309 |